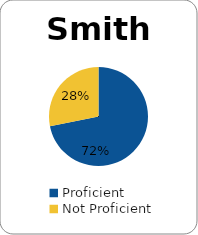
| Category | Series 0 |
|---|---|
| Proficient | 0.719 |
| Not Proficient | 0.281 |